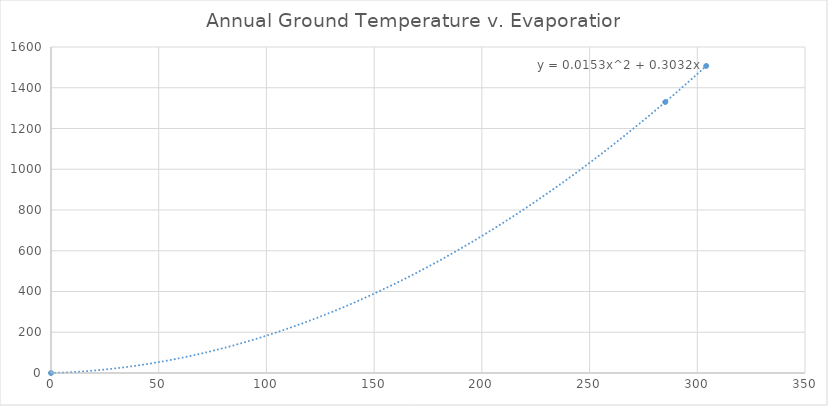
| Category | Series 0 |
|---|---|
| 285.15 | 1330 |
| 304.15 | 1507 |
| 0.0 | 0 |